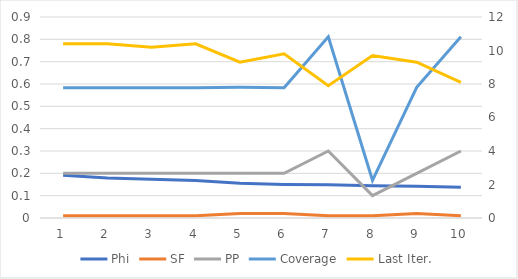
| Category | Phi | SF | PP | Coverage |
|---|---|---|---|---|
| 0 | 0.192 | 0.01 | 0.2 | 0.584 |
| 1 | 0.179 | 0.01 | 0.2 | 0.584 |
| 2 | 0.173 | 0.01 | 0.2 | 0.584 |
| 3 | 0.168 | 0.01 | 0.2 | 0.584 |
| 4 | 0.155 | 0.02 | 0.2 | 0.585 |
| 5 | 0.15 | 0.02 | 0.2 | 0.584 |
| 6 | 0.149 | 0.01 | 0.3 | 0.811 |
| 7 | 0.145 | 0.01 | 0.1 | 0.169 |
| 8 | 0.143 | 0.02 | 0.2 | 0.585 |
| 9 | 0.137 | 0.01 | 0.3 | 0.811 |